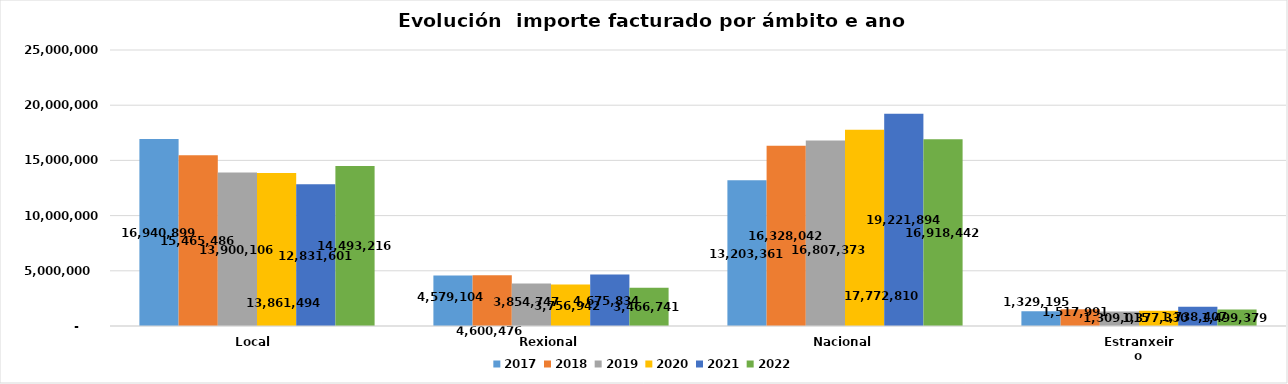
| Category | 2017 | 2018 | 2019 | 2020 | 2021 | 2022 |
|---|---|---|---|---|---|---|
| Local  | 16940898.74 | 15465485.87 | 13900106.15 | 13861493.53 | 12831600.75 | 14493215.78 |
| Rexional | 4579103.8 | 4600476.29 | 3854747.07 | 3756941.61 | 4675834.23 | 3466741.17 |
| Nacional | 13203361.04 | 16328042.16 | 16807373.42 | 17772810.06 | 19221893.94 | 16918442.41 |
| Estranxeiro | 1329194.63 | 1517991.1 | 1309014.91 | 1377330.22 | 1738407.25 | 1499379.3 |